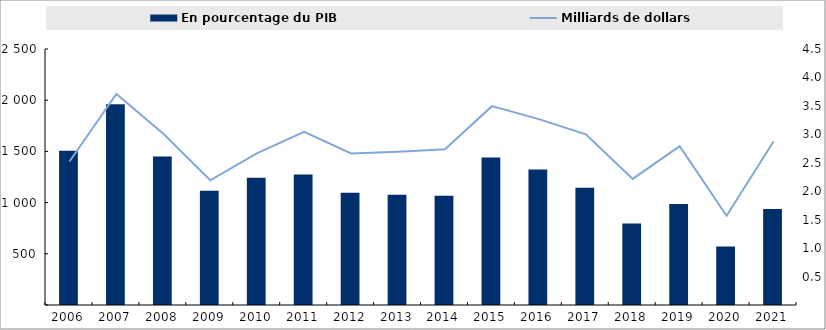
| Category | En pourcentage du PIB |
|---|---|
| 2006.0 | 2.71 |
| 2007.0 | 3.528 |
| 2008.0 | 2.61 |
| 2009.0 | 2.007 |
| 2010.0 | 2.235 |
| 2011.0 | 2.295 |
| 2012.0 | 1.972 |
| 2013.0 | 1.939 |
| 2014.0 | 1.92 |
| 2015.0 | 2.591 |
| 2016.0 | 2.383 |
| 2017.0 | 2.062 |
| 2018.0 | 1.434 |
| 2019.0 | 1.775 |
| 2020.0 | 1.026 |
| 2021.0 | 1.688 |